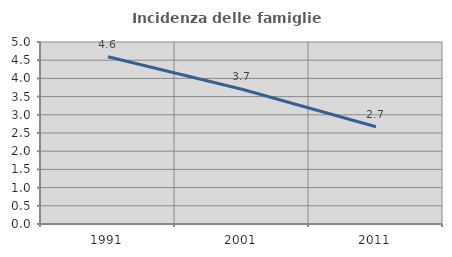
| Category | Incidenza delle famiglie numerose |
|---|---|
| 1991.0 | 4.595 |
| 2001.0 | 3.701 |
| 2011.0 | 2.672 |